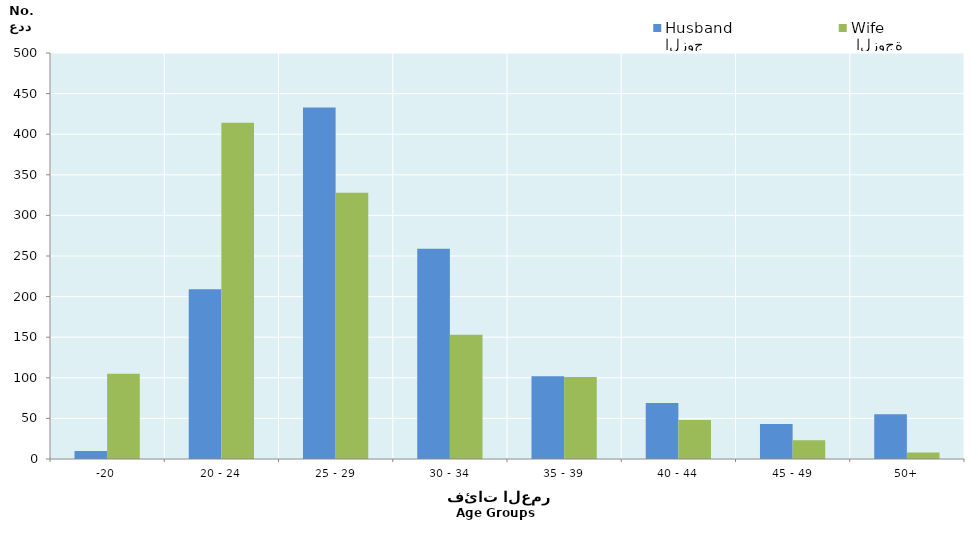
| Category | الزوج
Husband |  الزوجة
Wife |
|---|---|---|
| -20 | 10 | 105 |
| 20 - 24 | 209 | 414 |
| 25 - 29 | 433 | 328 |
| 30 - 34 | 259 | 153 |
| 35 - 39 | 102 | 101 |
| 40 - 44 | 69 | 48 |
| 45 - 49 | 43 | 23 |
| 50+ | 55 | 8 |